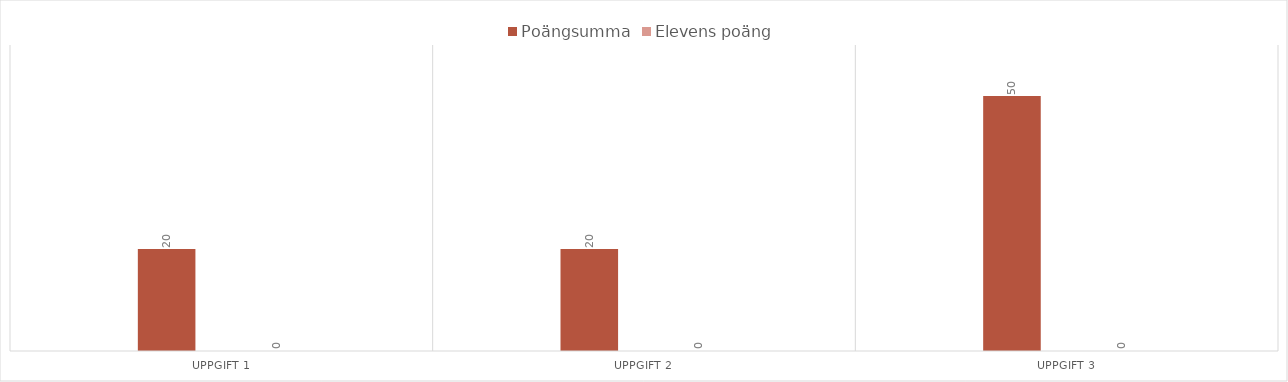
| Category | Poängsumma | Elevens poäng |
|---|---|---|
| Uppgift 1 | 20 | 20 |
| Uppgift 2 | 20 | 20 |
| Uppgift 3 | 50 | 50 |